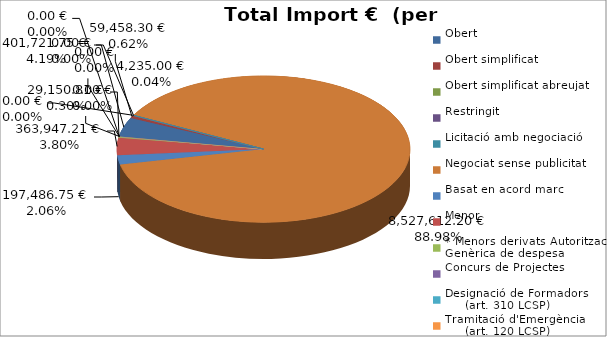
| Category | Total preu
(amb IVA) |
|---|---|
| Obert | 401721.75 |
| Obert simplificat | 59458.3 |
| Obert simplificat abreujat | 4235 |
| Restringit | 0 |
| Licitació amb negociació | 0 |
| Negociat sense publicitat | 8527612.2 |
| Basat en acord marc | 197486.75 |
| Menor | 363947.21 |
| * Menors derivats Autorització Genèrica de despesa | 29150.81 |
| Concurs de Projectes | 0 |
| Designació de Formadors
     (art. 310 LCSP) | 0 |
| Tramitació d'Emergència
     (art. 120 LCSP) | 0 |